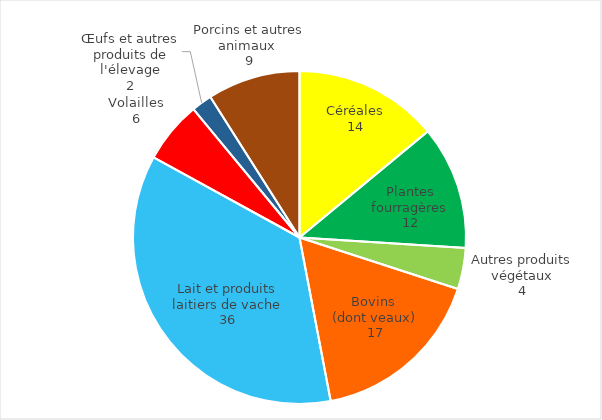
| Category | Series 0 |
|---|---|
| Céréales | 14 |
| Plantes fourragères | 12 |
| Autres produits végétaux | 4 |
| Bovins 
(dont veaux) | 17 |
| Lait et produits laitiers de vache | 36 |
| Volailles | 6 |
| Œufs et autres produits de l'élevage | 2 |
| Porcins et autres animaux  | 9 |